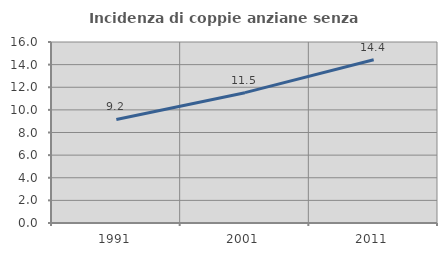
| Category | Incidenza di coppie anziane senza figli  |
|---|---|
| 1991.0 | 9.155 |
| 2001.0 | 11.521 |
| 2011.0 | 14.426 |